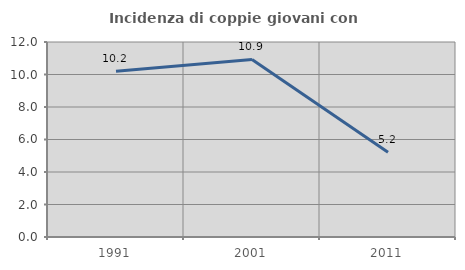
| Category | Incidenza di coppie giovani con figli |
|---|---|
| 1991.0 | 10.194 |
| 2001.0 | 10.927 |
| 2011.0 | 5.218 |